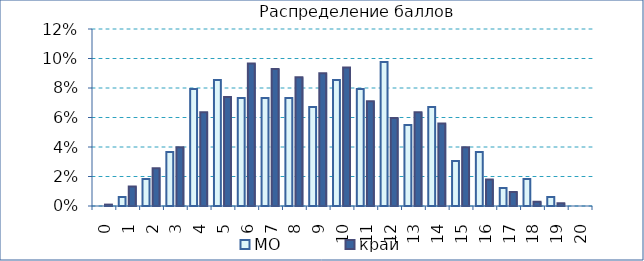
| Category | МО | край |
|---|---|---|
| 0.0 | 0 | 0.001 |
| 1.0 | 0.006 | 0.013 |
| 2.0 | 0.018 | 0.026 |
| 3.0 | 0.037 | 0.04 |
| 4.0 | 0.079 | 0.064 |
| 5.0 | 0.085 | 0.074 |
| 6.0 | 0.073 | 0.097 |
| 7.0 | 0.073 | 0.093 |
| 8.0 | 0.073 | 0.087 |
| 9.0 | 0.067 | 0.09 |
| 10.0 | 0.085 | 0.094 |
| 11.0 | 0.079 | 0.071 |
| 12.0 | 0.098 | 0.06 |
| 13.0 | 0.055 | 0.064 |
| 14.0 | 0.067 | 0.056 |
| 15.0 | 0.03 | 0.04 |
| 16.0 | 0.037 | 0.018 |
| 17.0 | 0.012 | 0.009 |
| 18.0 | 0.018 | 0.003 |
| 19.0 | 0.006 | 0.002 |
| 20.0 | 0 | 0 |